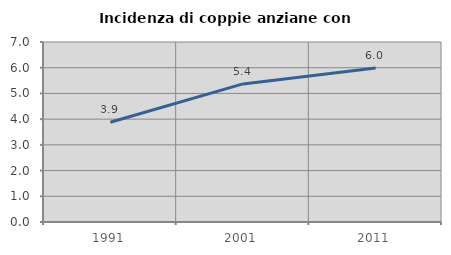
| Category | Incidenza di coppie anziane con figli |
|---|---|
| 1991.0 | 3.878 |
| 2001.0 | 5.371 |
| 2011.0 | 5.992 |